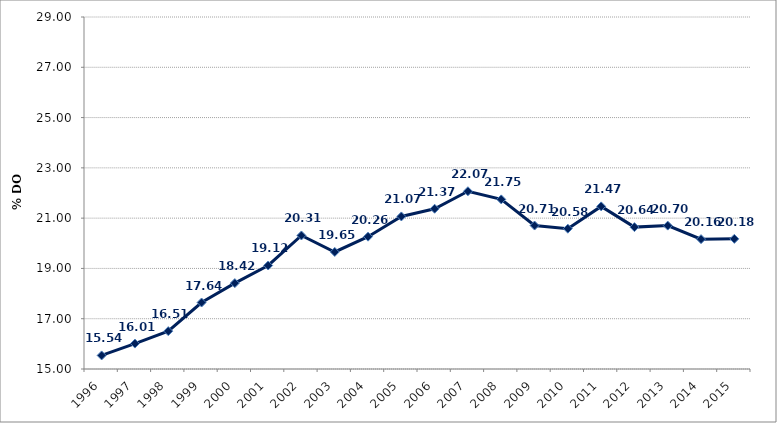
| Category | Series 0 |
|---|---|
| 1996 | 15.54 |
| 1997 | 16.011 |
| 1998 | 16.505 |
| 1999 | 17.644 |
| 2000 | 18.415 |
| 2001 | 19.117 |
| 2002 | 20.311 |
| 2003 | 19.654 |
| 2004 | 20.264 |
| 2005 | 21.068 |
| 2006 | 21.374 |
| 2007 | 22.069 |
| 2008 | 21.746 |
| 2009 | 20.706 |
| 2010 | 20.581 |
| 2011 | 21.467 |
| 2012 | 20.643 |
| 2013 | 20.703 |
| 2014 | 20.164 |
| 2015 | 20.176 |